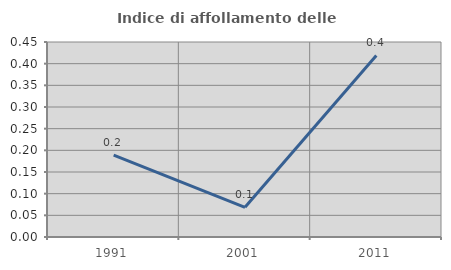
| Category | Indice di affollamento delle abitazioni  |
|---|---|
| 1991.0 | 0.189 |
| 2001.0 | 0.068 |
| 2011.0 | 0.419 |